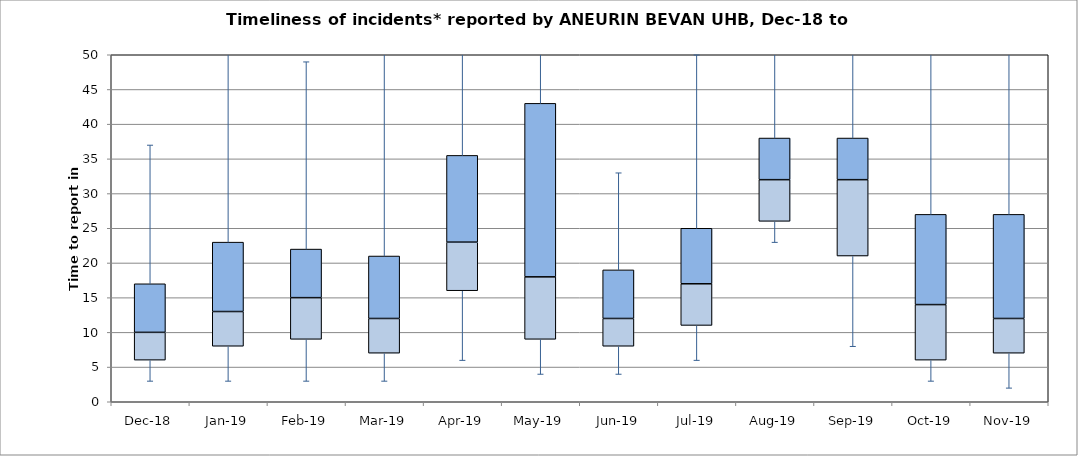
| Category | Series 0 | Series 1 | Series 2 |
|---|---|---|---|
| Dec-18 | 6 | 4 | 7 |
| Jan-19 | 8 | 5 | 10 |
| Feb-19 | 9 | 6 | 7 |
| Mar-19 | 7 | 5 | 9 |
| Apr-19 | 16 | 7 | 12.5 |
| May-19 | 9 | 9 | 25 |
| Jun-19 | 8 | 4 | 7 |
| Jul-19 | 11 | 6 | 8 |
| Aug-19 | 26 | 6 | 6 |
| Sep-19 | 21 | 11 | 6 |
| Oct-19 | 6 | 8 | 13 |
| Nov-19 | 7 | 5 | 15 |